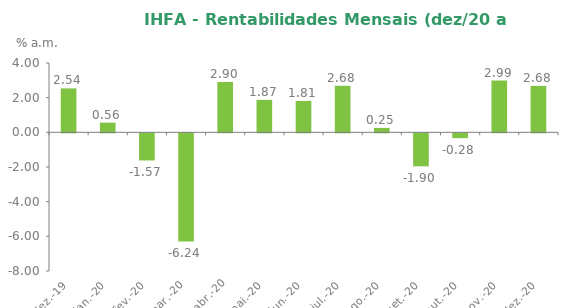
| Category | Series 0 |
|---|---|
| 2019-12-31 | 2.535 |
| 2020-01-31 | 0.558 |
| 2020-02-29 | -1.565 |
| 2020-03-31 | -6.239 |
| 2020-04-30 | 2.899 |
| 2020-05-31 | 1.874 |
| 2020-06-30 | 1.811 |
| 2020-07-31 | 2.684 |
| 2020-08-31 | 0.254 |
| 2020-09-30 | -1.901 |
| 2020-10-31 | -0.278 |
| 2020-11-30 | 2.988 |
| 2020-12-31 | 2.679 |